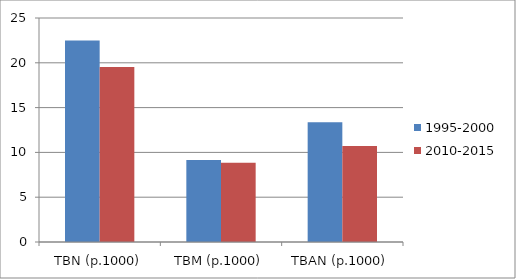
| Category | 1995-2000 | 2010-2015 |
|---|---|---|
| TBN (p.1000) | 22.501 | 19.543 |
| TBM (p.1000) | 9.147 | 8.834 |
| TBAN (p.1000) | 13.354 | 10.71 |